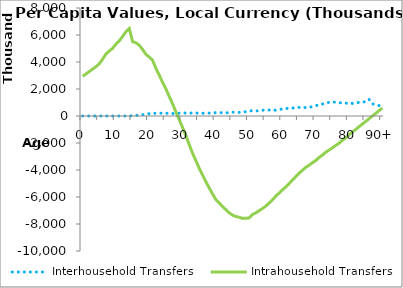
| Category | Interhousehold Transfers | Intrahousehold Transfers |
|---|---|---|
| 0 | 0 | 2939286.621 |
|  | 0 | 3118634.191 |
| 2 | 0 | 3297981.761 |
| 3 | 0 | 3477329.332 |
| 4 | 0 | 3656676.902 |
| 5 | 0 | 3871647.003 |
| 6 | 0 | 4213075.937 |
| 7 | 0 | 4599664.161 |
| 8 | 0 | 4816672.796 |
| 9 | 0 | 5013561.174 |
| 10 | 0 | 5335316.524 |
| 11 | 0 | 5564455.289 |
| 12 | 0 | 5893984.52 |
| 13 | 0 | 6247142.897 |
| 14 | 0 | 6478911.621 |
| 15 | 25299.077 | 5512722.492 |
| 16 | 42091.499 | 5424074.996 |
| 17 | 61057.009 | 5238314.833 |
| 18 | 97383.465 | 4930324.361 |
| 19 | 135990.612 | 4567580.454 |
| 20 | 175444.74 | 4364284.151 |
| 21 | 195922.709 | 4121998.522 |
| 22 | 201810.694 | 3530037.082 |
| 23 | 204127.768 | 3027427.625 |
| 24 | 214795.032 | 2495756.161 |
| 25 | 202271.248 | 2009294.264 |
| 26 | 197674.695 | 1445546.667 |
| 27 | 181694.989 | 904561.409 |
| 28 | 196080.384 | 297158.613 |
| 29 | 209909.162 | -275352.3 |
| 30 | 217224.618 | -846640.236 |
| 31 | 223735.67 | -1465490.475 |
| 32 | 220766.163 | -2121003.625 |
| 33 | 213615.693 | -2753554.324 |
| 34 | 220016.87 | -3312836.353 |
| 35 | 210797.021 | -3865893.257 |
| 36 | 202955.645 | -4376187.995 |
| 37 | 215487.824 | -4862404.872 |
| 38 | 215703.044 | -5326603.747 |
| 39 | 229101.25 | -5767088.81 |
| 40 | 247723.999 | -6183505.413 |
| 41 | 251993.225 | -6444466.983 |
| 42 | 241124.203 | -6700796.886 |
| 43 | 238245.441 | -6938673.079 |
| 44 | 241117.049 | -7166433.692 |
| 45 | 287972.977 | -7340519.275 |
| 46 | 275912.779 | -7444631.43 |
| 47 | 266484.779 | -7500035.107 |
| 48 | 288267.609 | -7584227.943 |
| 49 | 323945.515 | -7578400.171 |
| 50 | 357956.71 | -7546023.819 |
| 51 | 398980.494 | -7303625.786 |
| 52 | 369676.313 | -7174937.285 |
| 53 | 393799.926 | -7013248.757 |
| 54 | 427012.762 | -6849644.134 |
| 55 | 433053.132 | -6678480.896 |
| 56 | 442452.857 | -6448847.964 |
| 57 | 441522.037 | -6213234.81 |
| 58 | 427015.565 | -5939928.212 |
| 59 | 465823.669 | -5709334.829 |
| 60 | 534728.959 | -5470664.989 |
| 61 | 557600.931 | -5259477.824 |
| 62 | 569878.618 | -5003014.326 |
| 63 | 586055.289 | -4753312.077 |
| 64 | 629181.446 | -4490727.99 |
| 65 | 639941.626 | -4235161.894 |
| 66 | 649599.637 | -4022270.523 |
| 67 | 619346.931 | -3805858.563 |
| 68 | 633261.409 | -3649499.182 |
| 69 | 702400.533 | -3460312.287 |
| 70 | 780295.135 | -3298745.73 |
| 71 | 803545.96 | -3073499.886 |
| 72 | 884631.905 | -2888612 |
| 73 | 933643.878 | -2687365.374 |
| 74 | 1019643.875 | -2520101.753 |
| 75 | 1047757.936 | -2365992.91 |
| 76 | 1012015.819 | -2176988.254 |
| 77 | 965410.889 | -2017891.906 |
| 78 | 996954.677 | -1802684.41 |
| 79 | 946391.427 | -1628654.184 |
| 80 | 972128.415 | -1399255.97 |
| 81 | 932797.103 | -1195436.368 |
| 82 | 957527.301 | -997982.829 |
| 83 | 1011531.728 | -796353.969 |
| 84 | 1036037.4 | -595391.555 |
| 85 | 1052221.74 | -403757.574 |
| 86 | 1236547.787 | -205194.122 |
| 87 | 908453.558 | -6630.671 |
| 88 | 839693.773 | 191932.781 |
| 89 | 770933.987 | 390496.233 |
| 90+ | 702174.202 | 589059.685 |